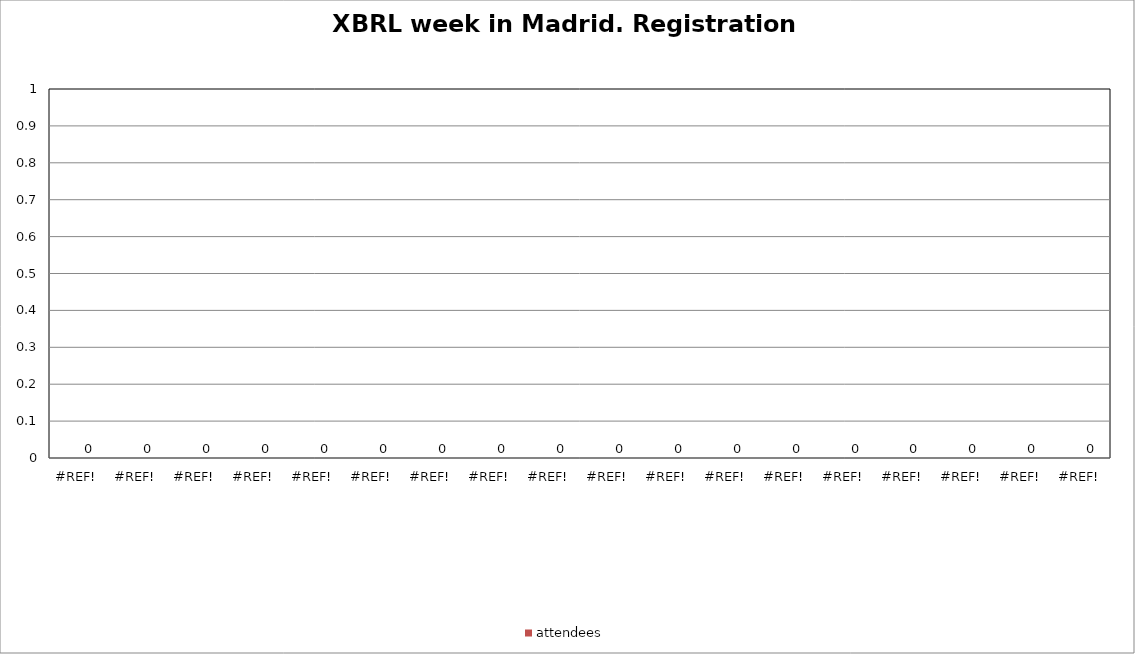
| Category | Session | attendees |
|---|---|---|
| 0.0 | 0 | 0 |
| 0.0 | 0 | 0 |
| 0.0 | 0 | 0 |
| 0.0 | 0 | 0 |
| 0.0 | 0 | 0 |
| 0.0 | 0 | 0 |
| 0.0 | 0 | 0 |
| 0.0 | 0 | 0 |
| 0.0 | 0 | 0 |
| 0.0 | 0 | 0 |
| 0.0 | 0 | 0 |
| 0.0 | 0 | 0 |
| 0.0 | 0 | 0 |
| 0.0 | 0 | 0 |
| 0.0 | 0 | 0 |
| 0.0 | 0 | 0 |
| 0.0 | 0 | 0 |
| 0.0 | 0 | 0 |